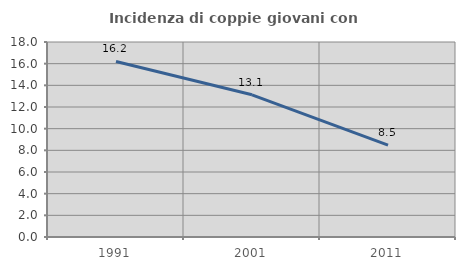
| Category | Incidenza di coppie giovani con figli |
|---|---|
| 1991.0 | 16.206 |
| 2001.0 | 13.123 |
| 2011.0 | 8.481 |